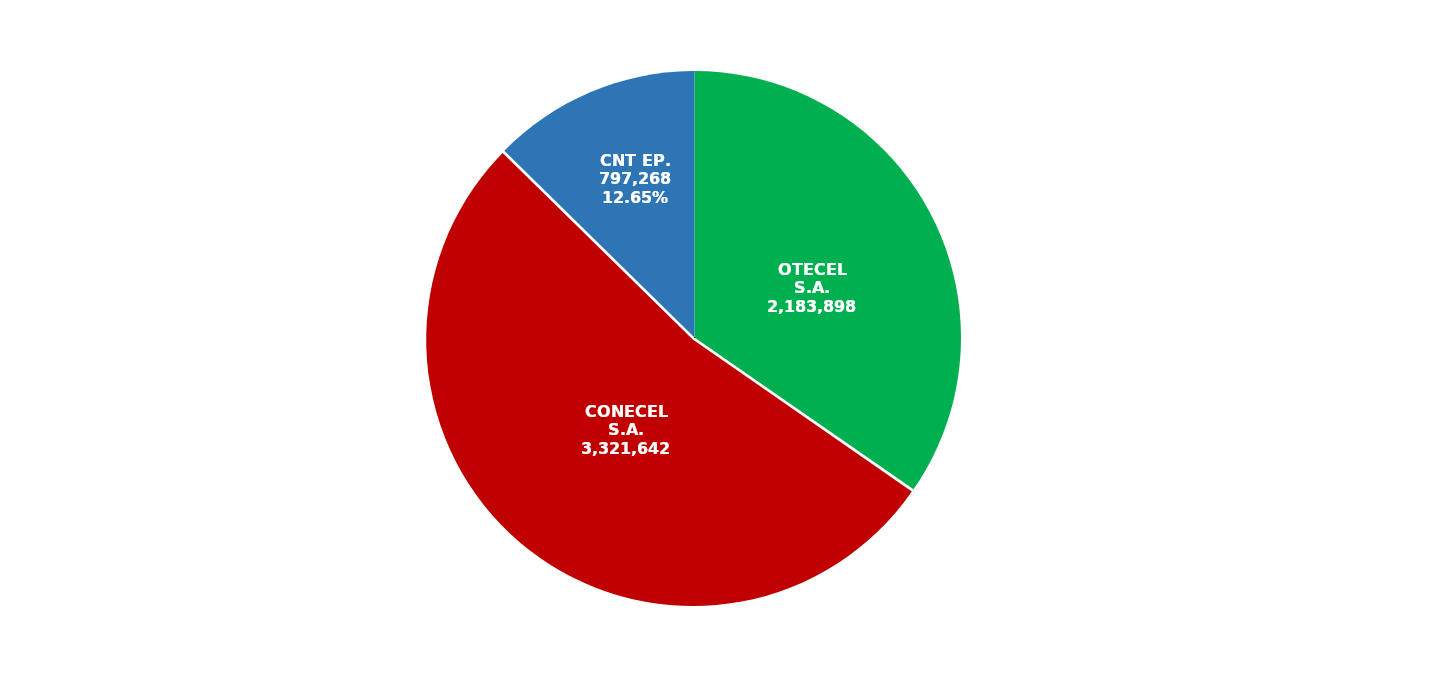
| Category | Series 0 |
|---|---|
| OTECEL S.A. | 2183898 |
| CONECEL S.A. | 3321642 |
| CNT EP. | 797268 |